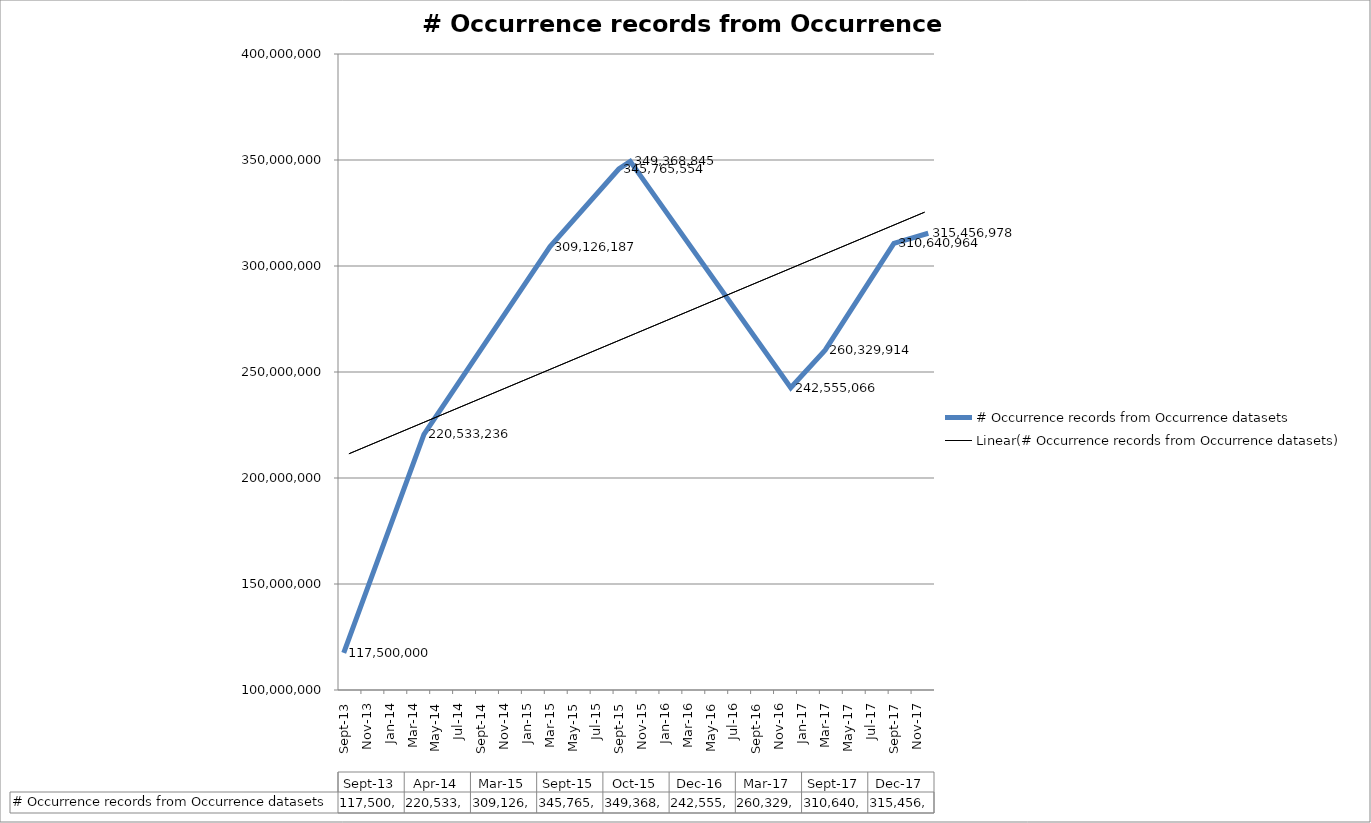
| Category | # Occurrence records from Occurrence datasets |
|---|---|
| 2013-09-01 | 117500000 |
| 2014-04-01 | 220533236 |
| 2015-03-01 | 309126187 |
| 2015-09-01 | 345765554 |
| 2015-10-16 | 349368845 |
| 2016-12-01 | 242555066 |
| 2017-03-01 | 260329914 |
| 2017-09-20 | 310640964 |
| 2017-12-04 | 315456978 |